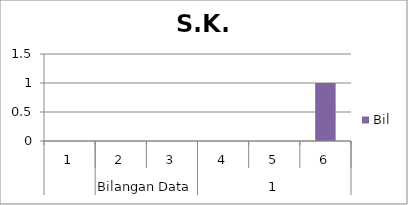
| Category | Bil |
|---|---|
| 0 | 0 |
| 1 | 0 |
| 2 | 0 |
| 3 | 0 |
| 4 | 0 |
| 5 | 1 |